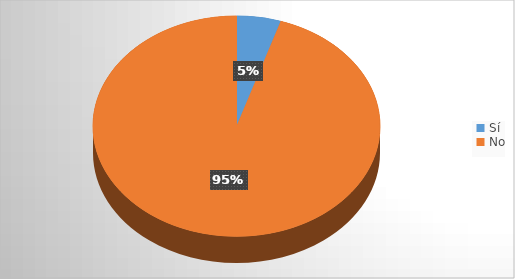
| Category | Series 0 |
|---|---|
| Sí | 9 |
| No | 172 |